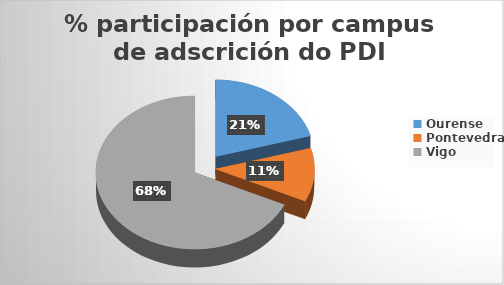
| Category | Series 0 |
|---|---|
| Ourense | 201 |
| Pontevedra | 110 |
| Vigo | 664 |